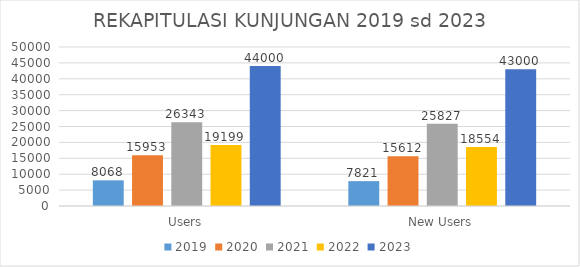
| Category | 2019 | 2020 | 2021 | 2022 | 2023 |
|---|---|---|---|---|---|
| Users | 8068 | 15953 | 26343 | 19199 | 44000 |
| New Users | 7821 | 15612 | 25827 | 18554 | 43000 |